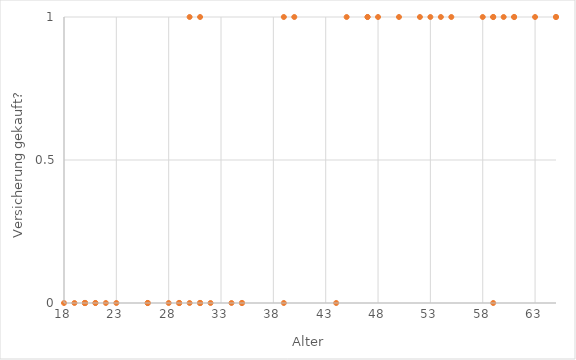
| Category | Series 0 |
|---|---|
| 54.0 | 1 |
| 40.0 | 1 |
| 31.0 | 0 |
| 47.0 | 1 |
| 59.0 | 1 |
| 53.0 | 1 |
| 52.0 | 1 |
| 18.0 | 0 |
| 35.0 | 0 |
| 31.0 | 0 |
| 22.0 | 0 |
| 61.0 | 1 |
| 35.0 | 0 |
| 31.0 | 1 |
| 20.0 | 0 |
| 29.0 | 0 |
| 55.0 | 1 |
| 30.0 | 0 |
| 44.0 | 0 |
| 58.0 | 1 |
| 21.0 | 0 |
| 50.0 | 1 |
| 31.0 | 0 |
| 26.0 | 0 |
| 39.0 | 1 |
| 32.0 | 0 |
| 65.0 | 1 |
| 34.0 | 0 |
| 20.0 | 0 |
| 26.0 | 0 |
| 28.0 | 0 |
| 47.0 | 1 |
| 59.0 | 1 |
| 48.0 | 1 |
| 23.0 | 0 |
| 60.0 | 1 |
| 21.0 | 0 |
| 29.0 | 0 |
| 61.0 | 1 |
| 63.0 | 1 |
| 19.0 | 0 |
| 59.0 | 0 |
| 20.0 | 0 |
| 20.0 | 0 |
| 29.0 | 0 |
| 30.0 | 1 |
| 65.0 | 1 |
| 39.0 | 0 |
| 45.0 | 1 |
| 26.0 | 0 |